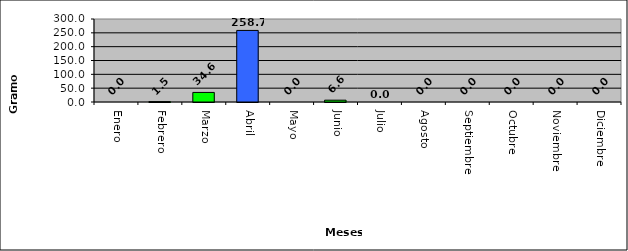
| Category | Hachís |
|---|---|
| Enero | 0 |
| Febrero | 1.5 |
| Marzo | 34.6 |
| Abril | 258.7 |
| Mayo | 0 |
| Junio | 6.6 |
| Julio | 0 |
| Agosto | 0 |
| Septiembre | 0 |
| Octubre | 0 |
| Noviembre | 0 |
| Diciembre | 0 |